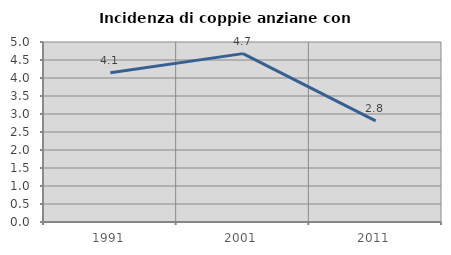
| Category | Incidenza di coppie anziane con figli |
|---|---|
| 1991.0 | 4.147 |
| 2001.0 | 4.677 |
| 2011.0 | 2.81 |